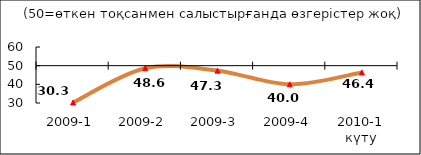
| Category | Диф.индекс ↓ |
|---|---|
| 2009-1 | 30.285 |
| 2009-2 | 48.62 |
| 2009-3 | 47.335 |
| 2009-4 | 40.005 |
| 2010-1 күту | 46.365 |